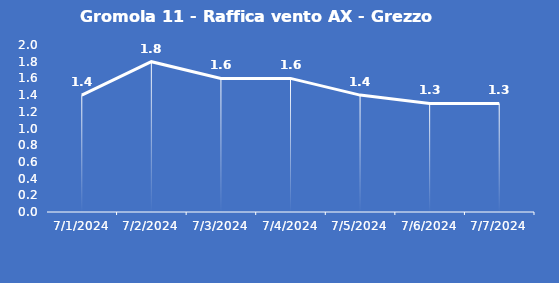
| Category | Gromola 11 - Raffica vento AX - Grezzo (m/s) |
|---|---|
| 7/1/24 | 1.4 |
| 7/2/24 | 1.8 |
| 7/3/24 | 1.6 |
| 7/4/24 | 1.6 |
| 7/5/24 | 1.4 |
| 7/6/24 | 1.3 |
| 7/7/24 | 1.3 |